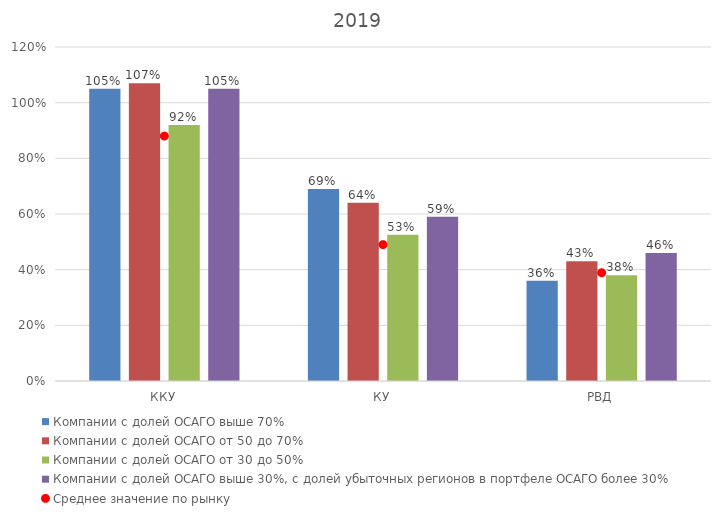
| Category | Компании с долей ОСАГО выше 70% | Компании с долей ОСАГО от 50 до 70% | Компании с долей ОСАГО от 30 до 50% | Компании с долей ОСАГО выше 30%, с долей убыточных регионов в портфеле ОСАГО более 30% |
|---|---|---|---|---|
| ККУ | 1.05 | 1.07 | 0.92 | 1.05 |
| КУ | 0.69 | 0.64 | 0.525 | 0.59 |
| РВД | 0.36 | 0.43 | 0.38 | 0.46 |